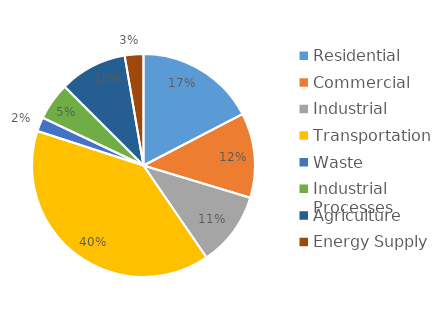
| Category | Series 0 |
|---|---|
| Residential | 1168188.017 |
| Commercial | 826924.871 |
| Industrial | 723125.395 |
| Transportation | 2660694.726 |
| Waste | 137304.369 |
| Industrial Processes | 366551.338 |
| Agriculture | 658260.266 |
| Energy Supply | 182312.729 |